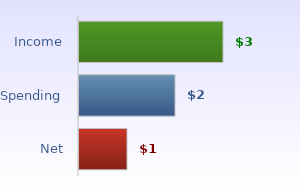
| Category | Series 2 |
|---|---|
| Net | 1 |
| Spending | 2 |
| Income | 3 |